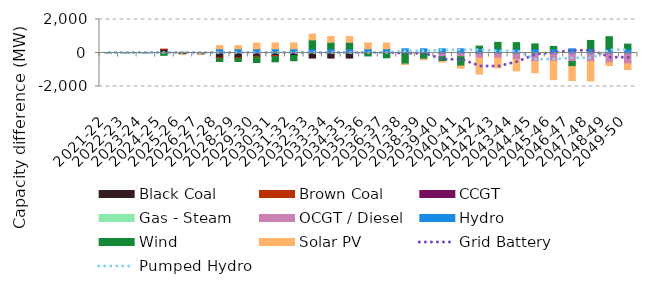
| Category | Black Coal | Brown Coal | CCGT | Gas - Steam | OCGT / Diesel | Hydro | Wind | Solar PV |
|---|---|---|---|---|---|---|---|---|
| 2021-22 | 0 | 0 | 0 | 0 | 0 | 0 | 0 | 0 |
| 2022-23 | 0 | 0 | 0 | 0 | 0 | 0 | 0 | 0 |
| 2023-24 | 0 | 0 | 0 | 0 | 0 | 0 | 0 | 0 |
| 2024-25 | 220.672 | 1.09 | 0 | 0 | 0 | 0 | -140.359 | 0 |
| 2025-26 | -88.062 | 1.09 | 0 | 0 | 0 | 0 | 40.087 | 0 |
| 2026-27 | -6.792 | -63.665 | 0 | 0 | 0 | 0 | 16.093 | 0 |
| 2027-28 | -273.971 | -63.665 | 0 | 0 | 0 | 250 | -169.155 | 190.231 |
| 2028-29 | -273.971 | -63.665 | 0 | 0 | 0 | 250 | -169.28 | 190.23 |
| 2029-30 | -191.419 | -63.66 | 0 | 0 | 0 | 250 | -313.826 | 346.198 |
| 2030-31 | -148.999 | -63.668 | 0 | 0 | 0 | 250 | -313.826 | 346.198 |
| 2031-32 | -148.993 | -0.001 | 0 | 0 | 0 | 250 | -313.827 | 346.198 |
| 2032-33 | -303.422 | 0 | 0 | 0 | 0 | 250 | 534.824 | 346.197 |
| 2033-34 | -303.422 | 0 | 0 | 0 | 0 | 250 | 389.562 | 346.196 |
| 2034-35 | -303.422 | 0 | 0 | 0 | 0 | 250 | 389.558 | 346.196 |
| 2035-36 | 5.319 | 0 | 0 | 0 | 0 | 250 | -174.46 | 346.196 |
| 2036-37 | 0 | 0 | 0 | 0 | 0 | 250 | -284.097 | 346.195 |
| 2037-38 | 0 | 0 | 0 | 0 | -0.002 | 250 | -657.673 | -32.137 |
| 2038-39 | 0 | 0 | 0 | 0 | -0.002 | 250 | -366.787 | -32.137 |
| 2039-40 | 0 | 0 | 0 | 0 | -223.421 | 250 | -282.541 | -32.137 |
| 2040-41 | 0 | 0 | 0 | 0 | -223.421 | 250 | -553.467 | -129.806 |
| 2041-42 | 0 | 0 | 0 | 0 | -309.42 | 250 | 160.3 | -948.37 |
| 2042-43 | 0 | 0 | -0.001 | 0 | -309.421 | 250 | 387.159 | -575.978 |
| 2043-44 | 0 | 0 | -0.001 | 0 | -388.274 | 250 | 368.619 | -676.382 |
| 2044-45 | 0 | 0 | -0.001 | 0 | -500.78 | 250 | 294.184 | -676.382 |
| 2045-46 | 0 | 0 | -0.001 | 0 | -493.157 | 250 | 144.313 | -1097.012 |
| 2046-47 | 0 | 0 | -0.001 | 0 | -512.56 | 250 | -295.424 | -835.326 |
| 2047-48 | 0 | 0 | -0.001 | 0 | -512.56 | 250 | 499.967 | -1154.846 |
| 2048-49 | 0 | 0 | -0.001 | 0 | -585.372 | 250 | 723.468 | -159.803 |
| 2049-50 | 0 | 0 | -0.001 | 0 | -645.067 | 250 | 280.161 | -343.368 |